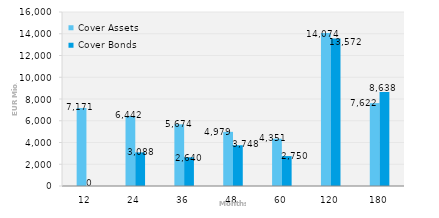
| Category | Cover Assets | Cover Bonds |
|---|---|---|
| 12.0 | 7170.559 | 0 |
| 24.0 | 6442.385 | 3088.049 |
| 36.0 | 5674.305 | 2640.1 |
| 48.0 | 4979.032 | 3747.622 |
| 60.0 | 4350.861 | 2750 |
| 120.0 | 14074.127 | 13571.653 |
| 180.0 | 7622.318 | 8637.962 |